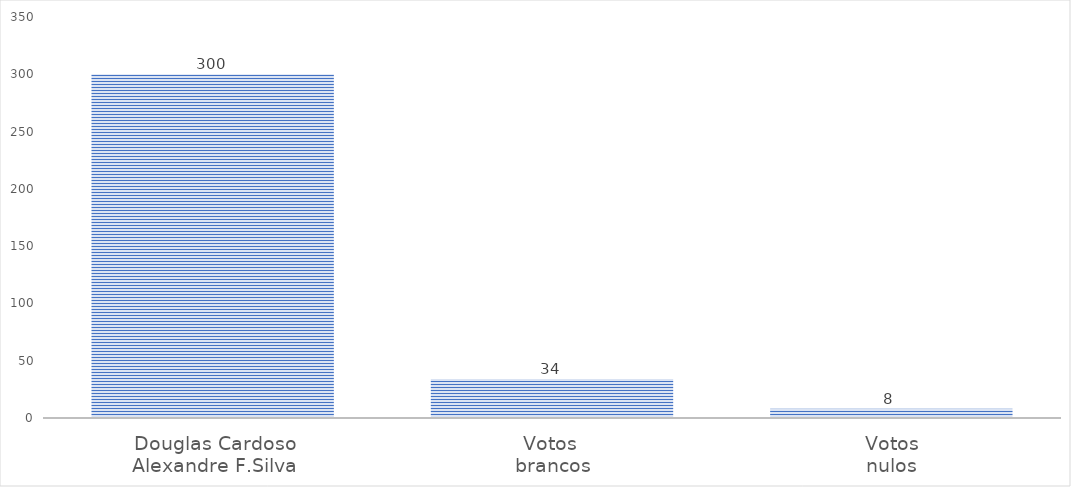
| Category | Series 0 |
|---|---|
| Douglas Cardoso
Alexandre F.Silva | 300 |
| Votos 
brancos | 34 |
| Votos
nulos | 8 |